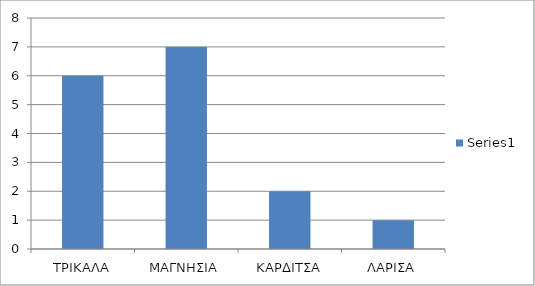
| Category | Series 0 |
|---|---|
| ΤΡΙΚΑΛΑ | 6 |
| ΜΑΓΝΗΣΙΑ | 7 |
| ΚΑΡΔΙΤΣΑ | 2 |
| ΛΑΡΙΣΑ | 1 |